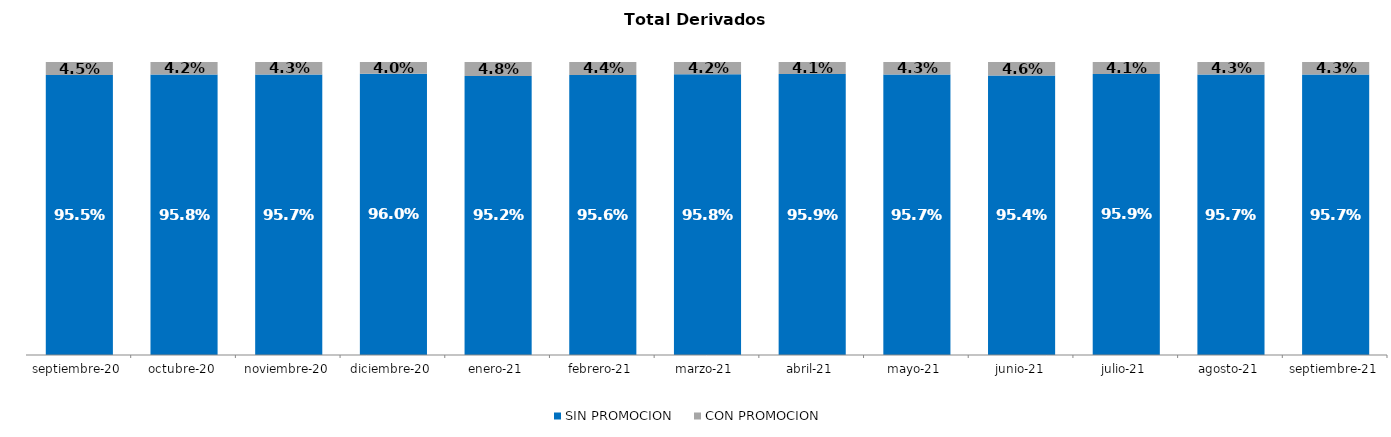
| Category | SIN PROMOCION   | CON PROMOCION   |
|---|---|---|
| 2020-09-01 | 0.955 | 0.045 |
| 2020-10-01 | 0.958 | 0.042 |
| 2020-11-01 | 0.957 | 0.043 |
| 2020-12-01 | 0.96 | 0.04 |
| 2021-01-01 | 0.952 | 0.048 |
| 2021-02-01 | 0.956 | 0.044 |
| 2021-03-01 | 0.958 | 0.042 |
| 2021-04-01 | 0.959 | 0.041 |
| 2021-05-01 | 0.957 | 0.043 |
| 2021-06-01 | 0.954 | 0.046 |
| 2021-07-01 | 0.959 | 0.041 |
| 2021-08-01 | 0.957 | 0.043 |
| 2021-09-01 | 0.957 | 0.043 |